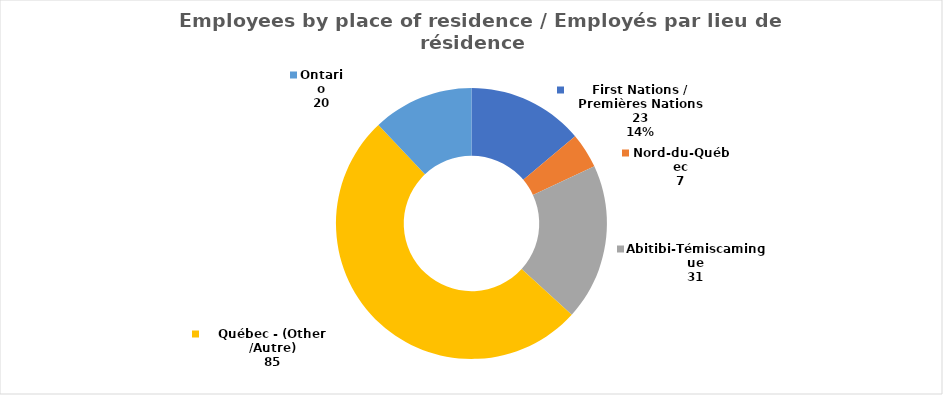
| Category | Series 0 |
|---|---|
| First Nations / Premières Nations | 23 |
| Nord-du-Québec | 7 |
| Abitibi-Témiscamingue | 31 |
| Québec - (Other /Autre) | 85 |
| Ontario | 20 |